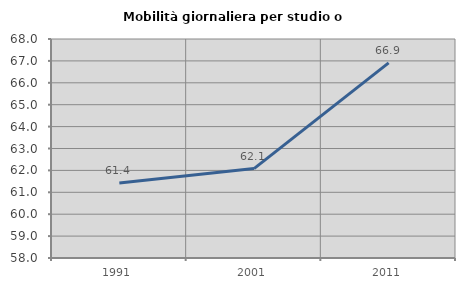
| Category | Mobilità giornaliera per studio o lavoro |
|---|---|
| 1991.0 | 61.421 |
| 2001.0 | 62.083 |
| 2011.0 | 66.908 |